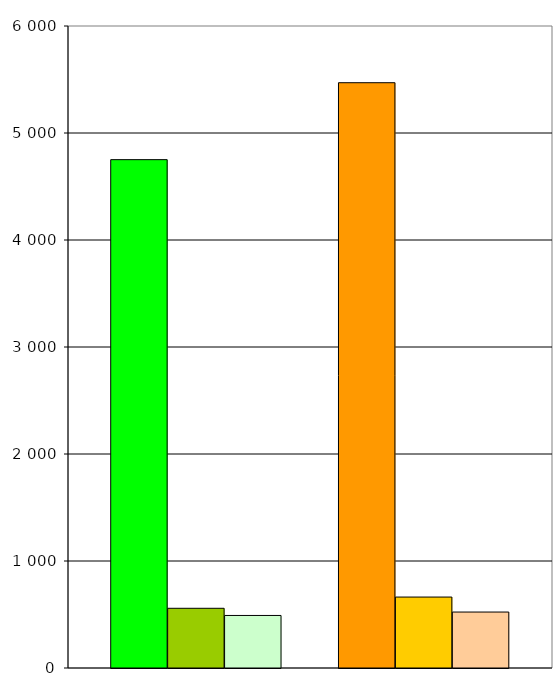
| Category | Series 0 | Series 1 | Series 2 | Series 3 | Series 4 | Series 5 | Series 6 |
|---|---|---|---|---|---|---|---|
| 0 | 4751 | 558 | 491 |  | 5470 | 663 | 523 |